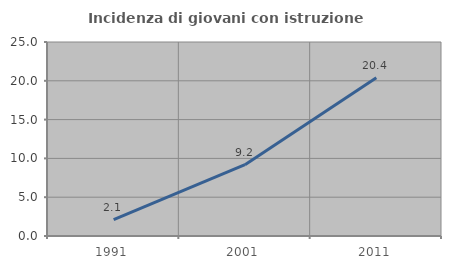
| Category | Incidenza di giovani con istruzione universitaria |
|---|---|
| 1991.0 | 2.105 |
| 2001.0 | 9.184 |
| 2011.0 | 20.408 |